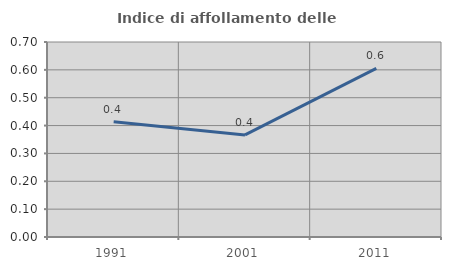
| Category | Indice di affollamento delle abitazioni  |
|---|---|
| 1991.0 | 0.413 |
| 2001.0 | 0.366 |
| 2011.0 | 0.605 |